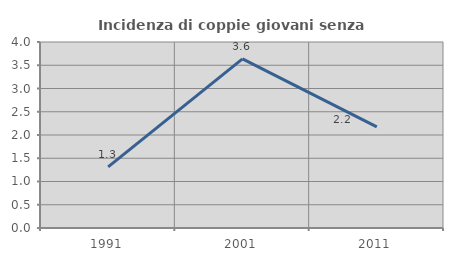
| Category | Incidenza di coppie giovani senza figli |
|---|---|
| 1991.0 | 1.316 |
| 2001.0 | 3.636 |
| 2011.0 | 2.174 |